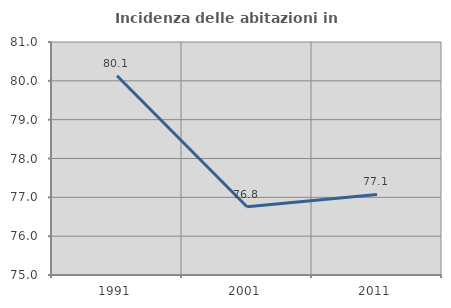
| Category | Incidenza delle abitazioni in proprietà  |
|---|---|
| 1991.0 | 80.132 |
| 2001.0 | 76.757 |
| 2011.0 | 77.075 |